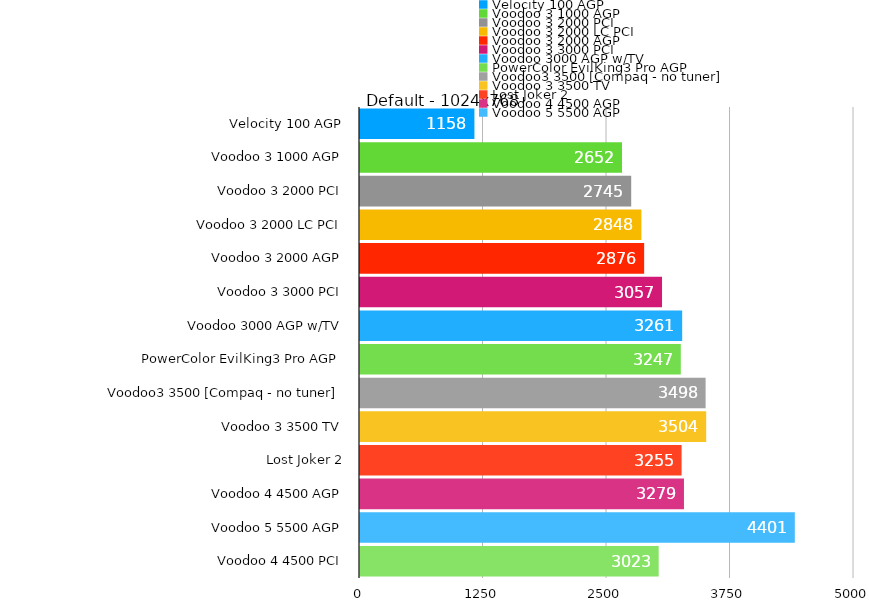
| Category | Default - 1024x768 |
|---|---|
| Velocity 100 AGP | 1158 |
| Voodoo 3 1000 AGP | 2652 |
| Voodoo 3 2000 PCI | 2745 |
| Voodoo 3 2000 LC PCI | 2848 |
| Voodoo 3 2000 AGP | 2876 |
| Voodoo 3 3000 PCI | 3057 |
| Voodoo 3000 AGP w/TV | 3261 |
| PowerColor EvilKing3 Pro AGP  | 3247 |
| Voodoo3 3500 [Compaq - no tuner] | 3498 |
| Voodoo 3 3500 TV | 3504 |
| Lost Joker 2 | 3255 |
| Voodoo 4 4500 AGP | 3279 |
| Voodoo 5 5500 AGP | 4401 |
| Voodoo 4 4500 PCI | 3023 |